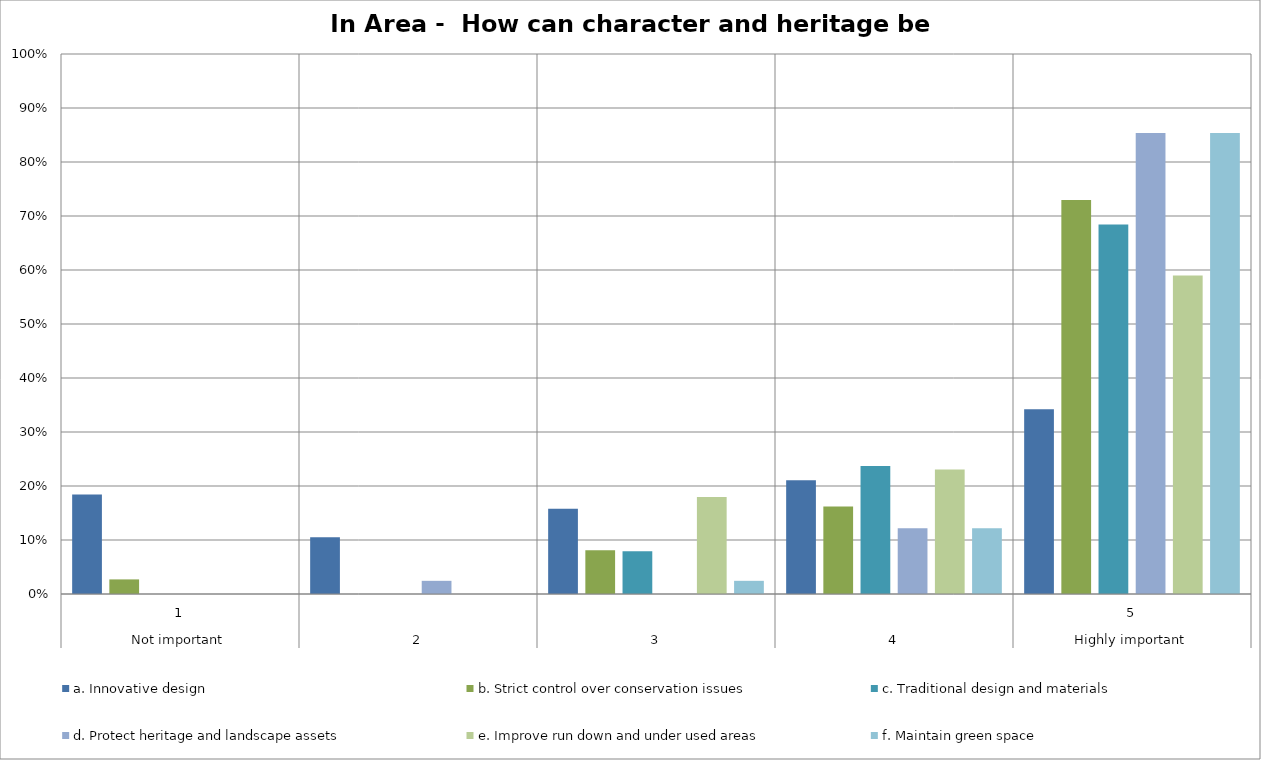
| Category | a. Innovative design | b. Strict control over conservation issues | c. Traditional design and materials | d. Protect heritage and landscape assets | e. Improve run down and under used areas | f. Maintain green space |
|---|---|---|---|---|---|---|
| 0 | 0.184 | 0.027 | 0 | 0 | 0 | 0 |
| 1 | 0.105 | 0 | 0 | 0.024 | 0 | 0 |
| 2 | 0.158 | 0.081 | 0.079 | 0 | 0.179 | 0.024 |
| 3 | 0.211 | 0.162 | 0.237 | 0.122 | 0.231 | 0.122 |
| 4 | 0.342 | 0.73 | 0.684 | 0.854 | 0.59 | 0.854 |